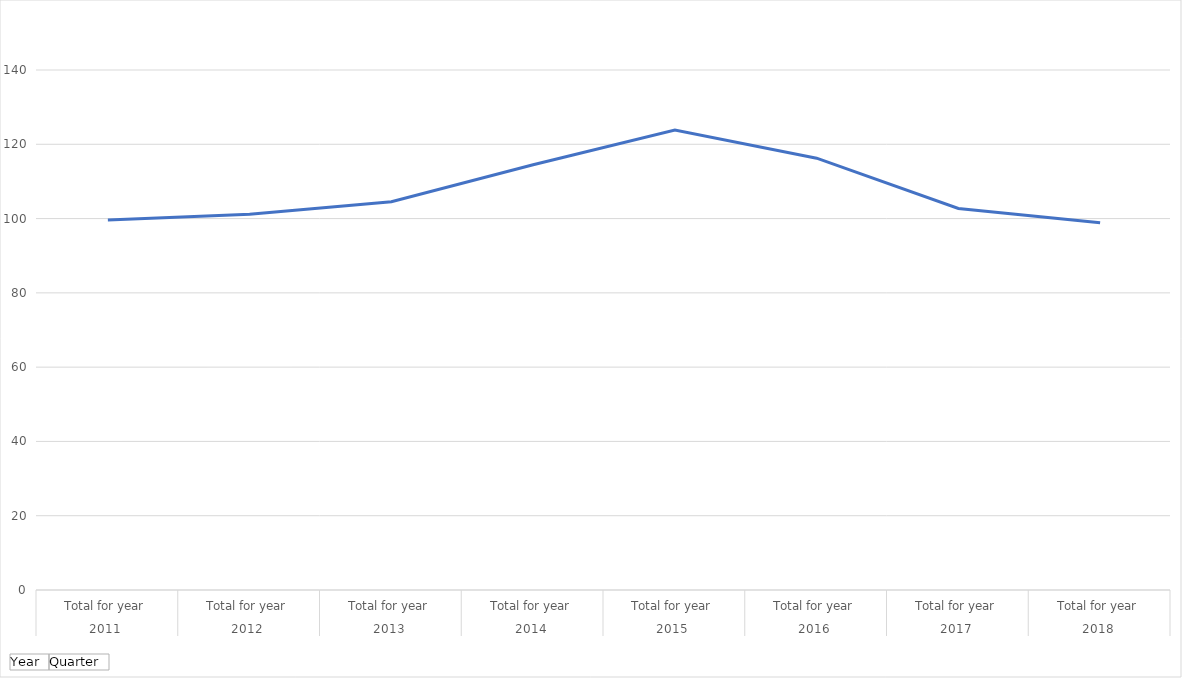
| Category | Total |
|---|---|
| 0 | 99.618 |
| 1 | 101.174 |
| 2 | 104.541 |
| 3 | 114.51 |
| 4 | 123.852 |
| 5 | 116.264 |
| 6 | 102.734 |
| 7 | 98.897 |